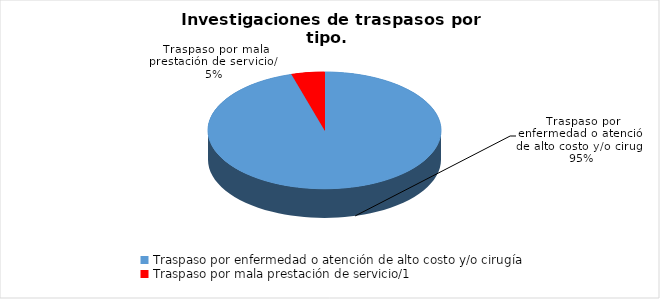
| Category | Series 0 |
|---|---|
| Traspaso por enfermedad o atención de alto costo y/o cirugía | 167 |
| Traspaso por mala prestación de servicio/1 | 8 |